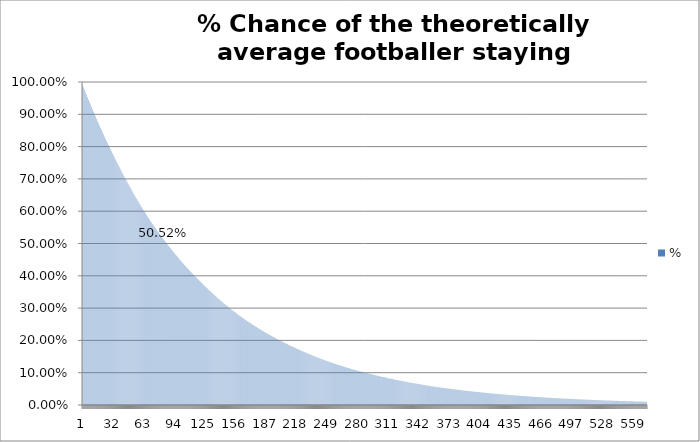
| Category | % |
|---|---|
| 0 | 0.992 |
| 1 | 0.984 |
| 2 | 0.976 |
| 3 | 0.968 |
| 4 | 0.961 |
| 5 | 0.953 |
| 6 | 0.945 |
| 7 | 0.938 |
| 8 | 0.93 |
| 9 | 0.923 |
| 10 | 0.915 |
| 11 | 0.908 |
| 12 | 0.901 |
| 13 | 0.894 |
| 14 | 0.886 |
| 15 | 0.879 |
| 16 | 0.872 |
| 17 | 0.865 |
| 18 | 0.858 |
| 19 | 0.852 |
| 20 | 0.845 |
| 21 | 0.838 |
| 22 | 0.831 |
| 23 | 0.825 |
| 24 | 0.818 |
| 25 | 0.812 |
| 26 | 0.805 |
| 27 | 0.799 |
| 28 | 0.792 |
| 29 | 0.786 |
| 30 | 0.78 |
| 31 | 0.773 |
| 32 | 0.767 |
| 33 | 0.761 |
| 34 | 0.755 |
| 35 | 0.749 |
| 36 | 0.743 |
| 37 | 0.737 |
| 38 | 0.731 |
| 39 | 0.725 |
| 40 | 0.719 |
| 41 | 0.714 |
| 42 | 0.708 |
| 43 | 0.702 |
| 44 | 0.697 |
| 45 | 0.691 |
| 46 | 0.686 |
| 47 | 0.68 |
| 48 | 0.675 |
| 49 | 0.669 |
| 50 | 0.664 |
| 51 | 0.659 |
| 52 | 0.653 |
| 53 | 0.648 |
| 54 | 0.643 |
| 55 | 0.638 |
| 56 | 0.633 |
| 57 | 0.628 |
| 58 | 0.623 |
| 59 | 0.618 |
| 60 | 0.613 |
| 61 | 0.608 |
| 62 | 0.603 |
| 63 | 0.598 |
| 64 | 0.593 |
| 65 | 0.589 |
| 66 | 0.584 |
| 67 | 0.579 |
| 68 | 0.575 |
| 69 | 0.57 |
| 70 | 0.565 |
| 71 | 0.561 |
| 72 | 0.556 |
| 73 | 0.552 |
| 74 | 0.547 |
| 75 | 0.543 |
| 76 | 0.539 |
| 77 | 0.534 |
| 78 | 0.53 |
| 79 | 0.526 |
| 80 | 0.522 |
| 81 | 0.518 |
| 82 | 0.513 |
| 83 | 0.509 |
| 84 | 0.505 |
| 85 | 0.501 |
| 86 | 0.497 |
| 87 | 0.493 |
| 88 | 0.489 |
| 89 | 0.485 |
| 90 | 0.481 |
| 91 | 0.478 |
| 92 | 0.474 |
| 93 | 0.47 |
| 94 | 0.466 |
| 95 | 0.463 |
| 96 | 0.459 |
| 97 | 0.455 |
| 98 | 0.451 |
| 99 | 0.448 |
| 100 | 0.444 |
| 101 | 0.441 |
| 102 | 0.437 |
| 103 | 0.434 |
| 104 | 0.43 |
| 105 | 0.427 |
| 106 | 0.423 |
| 107 | 0.42 |
| 108 | 0.417 |
| 109 | 0.413 |
| 110 | 0.41 |
| 111 | 0.407 |
| 112 | 0.403 |
| 113 | 0.4 |
| 114 | 0.397 |
| 115 | 0.394 |
| 116 | 0.391 |
| 117 | 0.388 |
| 118 | 0.384 |
| 119 | 0.381 |
| 120 | 0.378 |
| 121 | 0.375 |
| 122 | 0.372 |
| 123 | 0.369 |
| 124 | 0.366 |
| 125 | 0.363 |
| 126 | 0.361 |
| 127 | 0.358 |
| 128 | 0.355 |
| 129 | 0.352 |
| 130 | 0.349 |
| 131 | 0.346 |
| 132 | 0.344 |
| 133 | 0.341 |
| 134 | 0.338 |
| 135 | 0.335 |
| 136 | 0.333 |
| 137 | 0.33 |
| 138 | 0.327 |
| 139 | 0.325 |
| 140 | 0.322 |
| 141 | 0.32 |
| 142 | 0.317 |
| 143 | 0.315 |
| 144 | 0.312 |
| 145 | 0.31 |
| 146 | 0.307 |
| 147 | 0.305 |
| 148 | 0.302 |
| 149 | 0.3 |
| 150 | 0.297 |
| 151 | 0.295 |
| 152 | 0.293 |
| 153 | 0.29 |
| 154 | 0.288 |
| 155 | 0.286 |
| 156 | 0.283 |
| 157 | 0.281 |
| 158 | 0.279 |
| 159 | 0.277 |
| 160 | 0.274 |
| 161 | 0.272 |
| 162 | 0.27 |
| 163 | 0.268 |
| 164 | 0.266 |
| 165 | 0.264 |
| 166 | 0.261 |
| 167 | 0.259 |
| 168 | 0.257 |
| 169 | 0.255 |
| 170 | 0.253 |
| 171 | 0.251 |
| 172 | 0.249 |
| 173 | 0.247 |
| 174 | 0.245 |
| 175 | 0.243 |
| 176 | 0.241 |
| 177 | 0.239 |
| 178 | 0.237 |
| 179 | 0.236 |
| 180 | 0.234 |
| 181 | 0.232 |
| 182 | 0.23 |
| 183 | 0.228 |
| 184 | 0.226 |
| 185 | 0.224 |
| 186 | 0.223 |
| 187 | 0.221 |
| 188 | 0.219 |
| 189 | 0.217 |
| 190 | 0.216 |
| 191 | 0.214 |
| 192 | 0.212 |
| 193 | 0.211 |
| 194 | 0.209 |
| 195 | 0.207 |
| 196 | 0.205 |
| 197 | 0.204 |
| 198 | 0.202 |
| 199 | 0.201 |
| 200 | 0.199 |
| 201 | 0.197 |
| 202 | 0.196 |
| 203 | 0.194 |
| 204 | 0.193 |
| 205 | 0.191 |
| 206 | 0.19 |
| 207 | 0.188 |
| 208 | 0.187 |
| 209 | 0.185 |
| 210 | 0.184 |
| 211 | 0.182 |
| 212 | 0.181 |
| 213 | 0.179 |
| 214 | 0.178 |
| 215 | 0.176 |
| 216 | 0.175 |
| 217 | 0.174 |
| 218 | 0.172 |
| 219 | 0.171 |
| 220 | 0.169 |
| 221 | 0.168 |
| 222 | 0.167 |
| 223 | 0.165 |
| 224 | 0.164 |
| 225 | 0.163 |
| 226 | 0.161 |
| 227 | 0.16 |
| 228 | 0.159 |
| 229 | 0.158 |
| 230 | 0.156 |
| 231 | 0.155 |
| 232 | 0.154 |
| 233 | 0.153 |
| 234 | 0.151 |
| 235 | 0.15 |
| 236 | 0.149 |
| 237 | 0.148 |
| 238 | 0.147 |
| 239 | 0.145 |
| 240 | 0.144 |
| 241 | 0.143 |
| 242 | 0.142 |
| 243 | 0.141 |
| 244 | 0.14 |
| 245 | 0.139 |
| 246 | 0.138 |
| 247 | 0.136 |
| 248 | 0.135 |
| 249 | 0.134 |
| 250 | 0.133 |
| 251 | 0.132 |
| 252 | 0.131 |
| 253 | 0.13 |
| 254 | 0.129 |
| 255 | 0.128 |
| 256 | 0.127 |
| 257 | 0.126 |
| 258 | 0.125 |
| 259 | 0.124 |
| 260 | 0.123 |
| 261 | 0.122 |
| 262 | 0.121 |
| 263 | 0.12 |
| 264 | 0.119 |
| 265 | 0.118 |
| 266 | 0.117 |
| 267 | 0.116 |
| 268 | 0.115 |
| 269 | 0.114 |
| 270 | 0.113 |
| 271 | 0.113 |
| 272 | 0.112 |
| 273 | 0.111 |
| 274 | 0.11 |
| 275 | 0.109 |
| 276 | 0.108 |
| 277 | 0.107 |
| 278 | 0.106 |
| 279 | 0.106 |
| 280 | 0.105 |
| 281 | 0.104 |
| 282 | 0.103 |
| 283 | 0.102 |
| 284 | 0.101 |
| 285 | 0.101 |
| 286 | 0.1 |
| 287 | 0.099 |
| 288 | 0.098 |
| 289 | 0.097 |
| 290 | 0.097 |
| 291 | 0.096 |
| 292 | 0.095 |
| 293 | 0.094 |
| 294 | 0.094 |
| 295 | 0.093 |
| 296 | 0.092 |
| 297 | 0.091 |
| 298 | 0.091 |
| 299 | 0.09 |
| 300 | 0.089 |
| 301 | 0.088 |
| 302 | 0.088 |
| 303 | 0.087 |
| 304 | 0.086 |
| 305 | 0.086 |
| 306 | 0.085 |
| 307 | 0.084 |
| 308 | 0.084 |
| 309 | 0.083 |
| 310 | 0.082 |
| 311 | 0.082 |
| 312 | 0.081 |
| 313 | 0.08 |
| 314 | 0.08 |
| 315 | 0.079 |
| 316 | 0.078 |
| 317 | 0.078 |
| 318 | 0.077 |
| 319 | 0.077 |
| 320 | 0.076 |
| 321 | 0.075 |
| 322 | 0.075 |
| 323 | 0.074 |
| 324 | 0.074 |
| 325 | 0.073 |
| 326 | 0.072 |
| 327 | 0.072 |
| 328 | 0.071 |
| 329 | 0.071 |
| 330 | 0.07 |
| 331 | 0.069 |
| 332 | 0.069 |
| 333 | 0.068 |
| 334 | 0.068 |
| 335 | 0.067 |
| 336 | 0.067 |
| 337 | 0.066 |
| 338 | 0.066 |
| 339 | 0.065 |
| 340 | 0.065 |
| 341 | 0.064 |
| 342 | 0.064 |
| 343 | 0.063 |
| 344 | 0.063 |
| 345 | 0.062 |
| 346 | 0.062 |
| 347 | 0.061 |
| 348 | 0.061 |
| 349 | 0.06 |
| 350 | 0.06 |
| 351 | 0.059 |
| 352 | 0.059 |
| 353 | 0.058 |
| 354 | 0.058 |
| 355 | 0.057 |
| 356 | 0.057 |
| 357 | 0.056 |
| 358 | 0.056 |
| 359 | 0.055 |
| 360 | 0.055 |
| 361 | 0.055 |
| 362 | 0.054 |
| 363 | 0.054 |
| 364 | 0.053 |
| 365 | 0.053 |
| 366 | 0.052 |
| 367 | 0.052 |
| 368 | 0.052 |
| 369 | 0.051 |
| 370 | 0.051 |
| 371 | 0.05 |
| 372 | 0.05 |
| 373 | 0.05 |
| 374 | 0.049 |
| 375 | 0.049 |
| 376 | 0.048 |
| 377 | 0.048 |
| 378 | 0.048 |
| 379 | 0.047 |
| 380 | 0.047 |
| 381 | 0.047 |
| 382 | 0.046 |
| 383 | 0.046 |
| 384 | 0.045 |
| 385 | 0.045 |
| 386 | 0.045 |
| 387 | 0.044 |
| 388 | 0.044 |
| 389 | 0.044 |
| 390 | 0.043 |
| 391 | 0.043 |
| 392 | 0.043 |
| 393 | 0.042 |
| 394 | 0.042 |
| 395 | 0.042 |
| 396 | 0.041 |
| 397 | 0.041 |
| 398 | 0.041 |
| 399 | 0.04 |
| 400 | 0.04 |
| 401 | 0.04 |
| 402 | 0.039 |
| 403 | 0.039 |
| 404 | 0.039 |
| 405 | 0.038 |
| 406 | 0.038 |
| 407 | 0.038 |
| 408 | 0.037 |
| 409 | 0.037 |
| 410 | 0.037 |
| 411 | 0.037 |
| 412 | 0.036 |
| 413 | 0.036 |
| 414 | 0.036 |
| 415 | 0.035 |
| 416 | 0.035 |
| 417 | 0.035 |
| 418 | 0.035 |
| 419 | 0.034 |
| 420 | 0.034 |
| 421 | 0.034 |
| 422 | 0.033 |
| 423 | 0.033 |
| 424 | 0.033 |
| 425 | 0.033 |
| 426 | 0.032 |
| 427 | 0.032 |
| 428 | 0.032 |
| 429 | 0.032 |
| 430 | 0.031 |
| 431 | 0.031 |
| 432 | 0.031 |
| 433 | 0.031 |
| 434 | 0.03 |
| 435 | 0.03 |
| 436 | 0.03 |
| 437 | 0.03 |
| 438 | 0.029 |
| 439 | 0.029 |
| 440 | 0.029 |
| 441 | 0.029 |
| 442 | 0.028 |
| 443 | 0.028 |
| 444 | 0.028 |
| 445 | 0.028 |
| 446 | 0.028 |
| 447 | 0.027 |
| 448 | 0.027 |
| 449 | 0.027 |
| 450 | 0.027 |
| 451 | 0.027 |
| 452 | 0.026 |
| 453 | 0.026 |
| 454 | 0.026 |
| 455 | 0.026 |
| 456 | 0.025 |
| 457 | 0.025 |
| 458 | 0.025 |
| 459 | 0.025 |
| 460 | 0.025 |
| 461 | 0.024 |
| 462 | 0.024 |
| 463 | 0.024 |
| 464 | 0.024 |
| 465 | 0.024 |
| 466 | 0.023 |
| 467 | 0.023 |
| 468 | 0.023 |
| 469 | 0.023 |
| 470 | 0.023 |
| 471 | 0.023 |
| 472 | 0.022 |
| 473 | 0.022 |
| 474 | 0.022 |
| 475 | 0.022 |
| 476 | 0.022 |
| 477 | 0.022 |
| 478 | 0.021 |
| 479 | 0.021 |
| 480 | 0.021 |
| 481 | 0.021 |
| 482 | 0.021 |
| 483 | 0.02 |
| 484 | 0.02 |
| 485 | 0.02 |
| 486 | 0.02 |
| 487 | 0.02 |
| 488 | 0.02 |
| 489 | 0.02 |
| 490 | 0.019 |
| 491 | 0.019 |
| 492 | 0.019 |
| 493 | 0.019 |
| 494 | 0.019 |
| 495 | 0.019 |
| 496 | 0.018 |
| 497 | 0.018 |
| 498 | 0.018 |
| 499 | 0.018 |
| 500 | 0.018 |
| 501 | 0.018 |
| 502 | 0.018 |
| 503 | 0.017 |
| 504 | 0.017 |
| 505 | 0.017 |
| 506 | 0.017 |
| 507 | 0.017 |
| 508 | 0.017 |
| 509 | 0.017 |
| 510 | 0.016 |
| 511 | 0.016 |
| 512 | 0.016 |
| 513 | 0.016 |
| 514 | 0.016 |
| 515 | 0.016 |
| 516 | 0.016 |
| 517 | 0.016 |
| 518 | 0.015 |
| 519 | 0.015 |
| 520 | 0.015 |
| 521 | 0.015 |
| 522 | 0.015 |
| 523 | 0.015 |
| 524 | 0.015 |
| 525 | 0.015 |
| 526 | 0.015 |
| 527 | 0.014 |
| 528 | 0.014 |
| 529 | 0.014 |
| 530 | 0.014 |
| 531 | 0.014 |
| 532 | 0.014 |
| 533 | 0.014 |
| 534 | 0.014 |
| 535 | 0.013 |
| 536 | 0.013 |
| 537 | 0.013 |
| 538 | 0.013 |
| 539 | 0.013 |
| 540 | 0.013 |
| 541 | 0.013 |
| 542 | 0.013 |
| 543 | 0.013 |
| 544 | 0.013 |
| 545 | 0.012 |
| 546 | 0.012 |
| 547 | 0.012 |
| 548 | 0.012 |
| 549 | 0.012 |
| 550 | 0.012 |
| 551 | 0.012 |
| 552 | 0.012 |
| 553 | 0.012 |
| 554 | 0.012 |
| 555 | 0.011 |
| 556 | 0.011 |
| 557 | 0.011 |
| 558 | 0.011 |
| 559 | 0.011 |
| 560 | 0.011 |
| 561 | 0.011 |
| 562 | 0.011 |
| 563 | 0.011 |
| 564 | 0.011 |
| 565 | 0.011 |
| 566 | 0.011 |
| 567 | 0.01 |
| 568 | 0.01 |
| 569 | 0.01 |
| 570 | 0.01 |